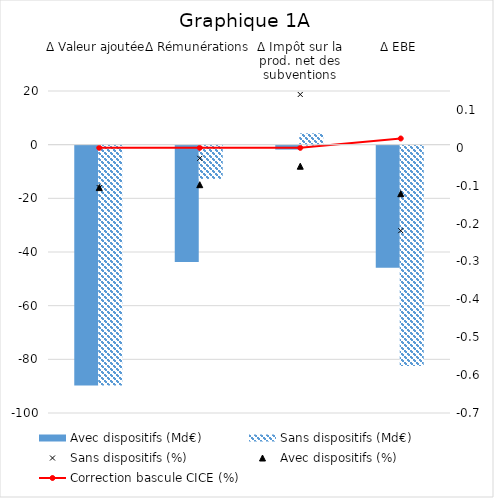
| Category | Avec dispositifs (Md€) | Sans dispositifs (Md€) |
|---|---|---|
| Δ Valeur ajoutée | -89.366 | -89.366 |
| Δ Rémunérations | -43.363 | -12.392 |
| Δ Impôt sur la prod. net des subventions | -1.451 | 4.211 |
| Δ EBE | -45.467 | -82.1 |